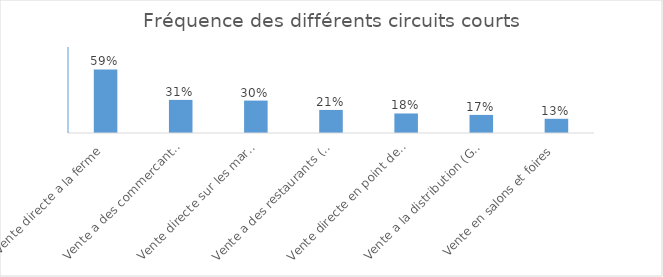
| Category | Series 0 |
|---|---|
| Vente directe a la ferme | 0.592 |
| Vente a des commercants detaillants | 0.308 |
| Vente directe sur les marchés/halles | 0.302 |
| Vente a des restaurants (hors rest. collective) | 0.214 |
| Vente directe en point de vente collectif | 0.182 |
| Vente a la distribution (GMS) | 0.168 |
| Vente en salons et foires | 0.132 |